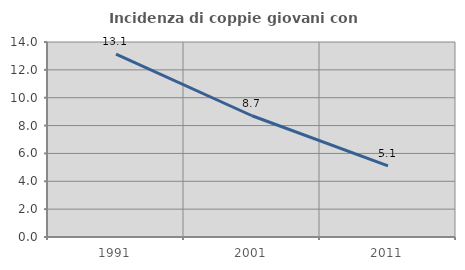
| Category | Incidenza di coppie giovani con figli |
|---|---|
| 1991.0 | 13.126 |
| 2001.0 | 8.705 |
| 2011.0 | 5.1 |